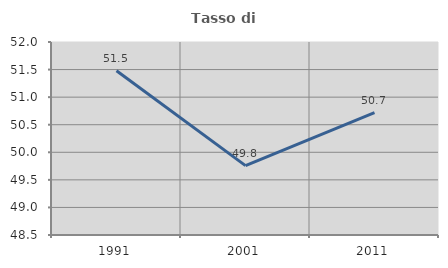
| Category | Tasso di occupazione   |
|---|---|
| 1991.0 | 51.479 |
| 2001.0 | 49.758 |
| 2011.0 | 50.718 |